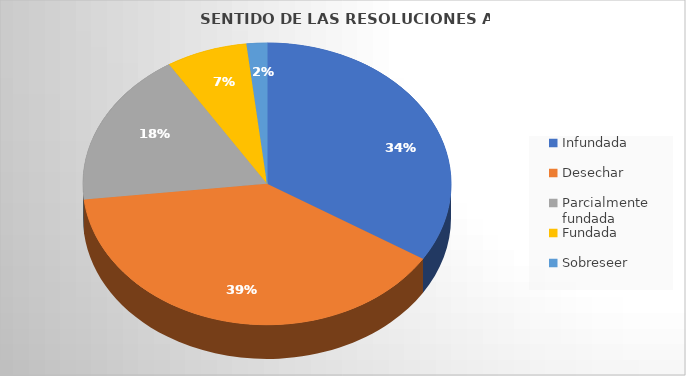
| Category | Series 0 |
|---|---|
| Infundada | 19 |
| Desechar | 22 |
| Parcialmente fundada | 10 |
| Fundada | 4 |
| Sobreseer | 1 |